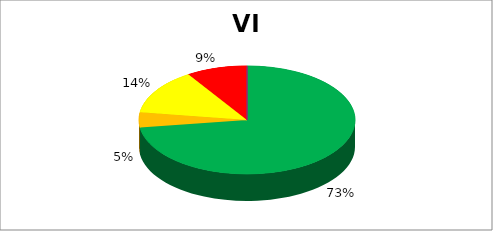
| Category | VI Образовање |
|---|---|
| 0 | 0.727 |
| 1 | 0.045 |
| 2 | 0.136 |
| 3 | 0.091 |
| 4 | 0 |